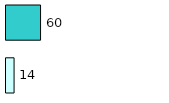
| Category | Series 0 | Series 1 |
|---|---|---|
| 0 | 14 | 60 |